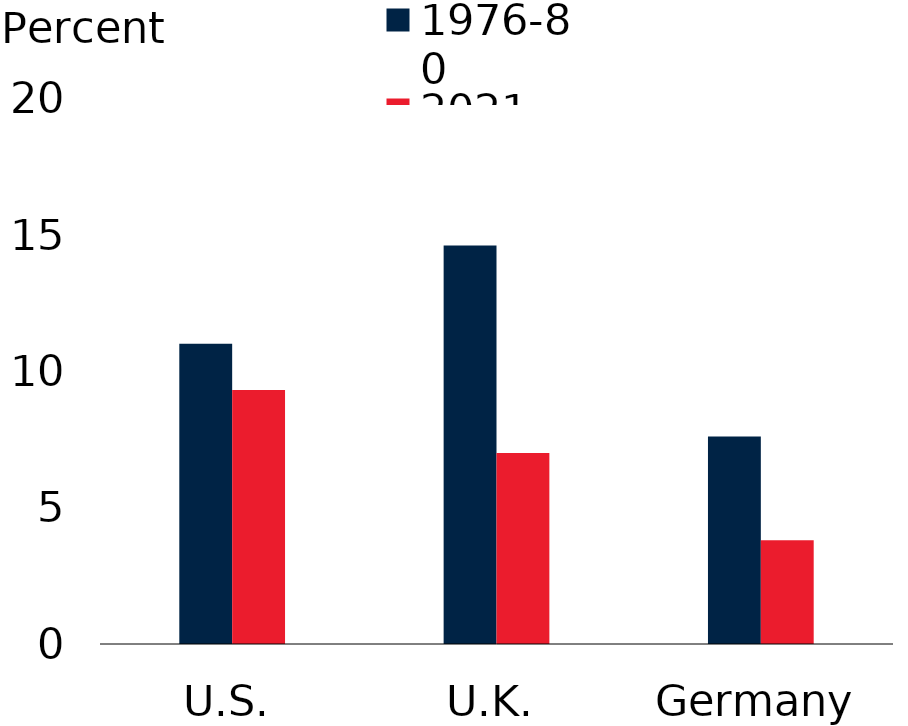
| Category | 1976-80 | 2021 |
|---|---|---|
| U.S. | 11 | 9.3 |
| U.K. | 14.6 | 7 |
| Germany | 7.6 | 3.8 |